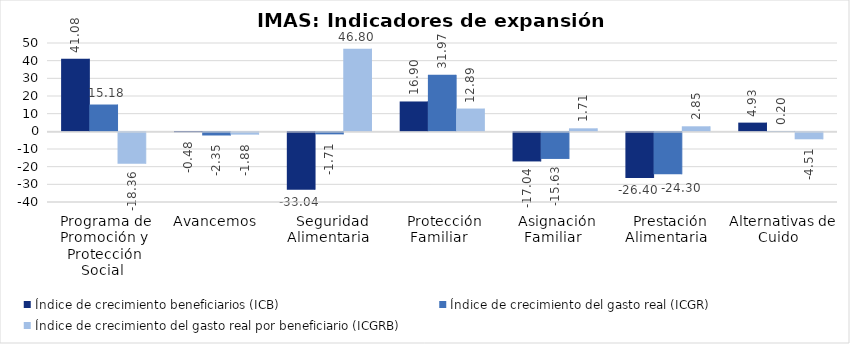
| Category | Índice de crecimiento beneficiarios (ICB)  | Índice de crecimiento del gasto real (ICGR)  | Índice de crecimiento del gasto real por beneficiario (ICGRB)  |
|---|---|---|---|
| Programa de Promoción y Protección Social | 41.085 | 15.178 | -18.363 |
| Avancemos | -0.485 | -2.351 | -1.875 |
| Seguridad Alimentaria | -33.043 | -1.708 | 46.798 |
| Protección Familiar  | 16.899 | 31.971 | 12.893 |
| Asignación Familiar | -17.041 | -15.626 | 1.706 |
| Prestación Alimentaria | -26.4 | -24.303 | 2.85 |
| Alternativas de Cuido | 4.932 | 0.199 | -4.51 |